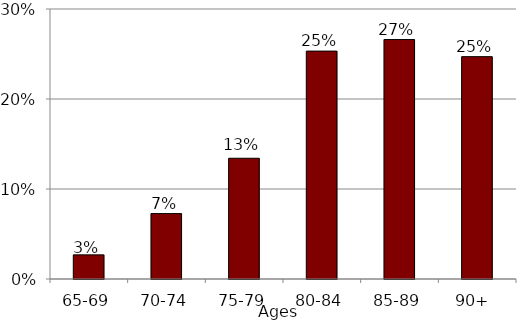
| Category | Established dementia  |
|---|---|
| 65-69 | 0.027 |
| 70-74 | 0.073 |
| 75-79 | 0.134 |
| 80-84 | 0.253 |
| 85-89 | 0.266 |
| 90+  | 0.247 |